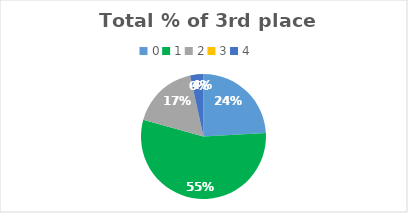
| Category | # |
|---|---|
| 0.0 | 7 |
| 1.0 | 16 |
| 2.0 | 5 |
| 3.0 | 0 |
| 4.0 | 1 |